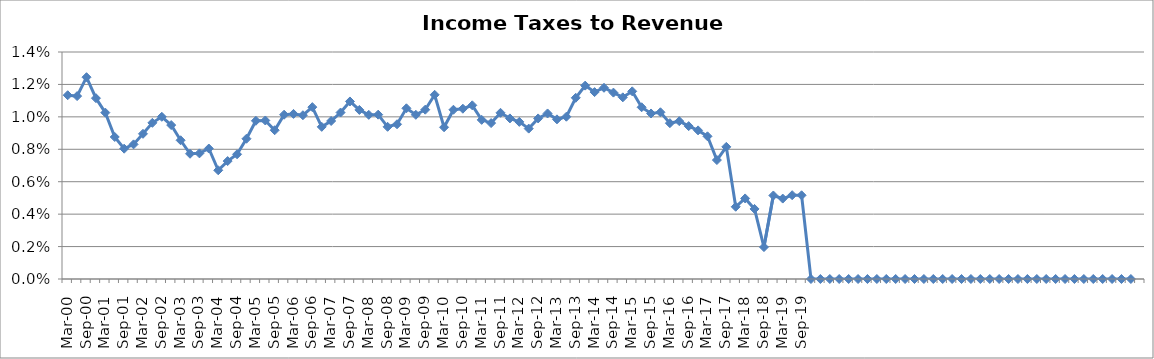
| Category | Income Taxes to Revenue (%) |
|---|---|
| Mar-00 | 0.011 |
| Jun-00 | 0.011 |
| Sep-00 | 0.012 |
| Dec-00 | 0.011 |
| Mar-01 | 0.01 |
| Jun-01 | 0.009 |
| Sep-01 | 0.008 |
| Dec-01 | 0.008 |
| Mar-02 | 0.009 |
| Jun-02 | 0.01 |
| Sep-02 | 0.01 |
| Dec-02 | 0.009 |
| Mar-03 | 0.009 |
| Jun-03 | 0.008 |
| Sep-03 | 0.008 |
| Dec-03 | 0.008 |
| Mar-04 | 0.007 |
| Jun-04 | 0.007 |
| Sep-04 | 0.008 |
| Dec-04 | 0.009 |
| Mar-05 | 0.01 |
| Jun-05 | 0.01 |
| Sep-05 | 0.009 |
| Dec-05 | 0.01 |
| Mar-06 | 0.01 |
| Jun-06 | 0.01 |
| Sep-06 | 0.011 |
| Dec-06 | 0.009 |
| Mar-07 | 0.01 |
| Jun-07 | 0.01 |
| Sep-07 | 0.011 |
| Dec-07 | 0.01 |
| Mar-08 | 0.01 |
| Jun-08 | 0.01 |
| Sep-08 | 0.009 |
| Dec-08 | 0.01 |
| Mar-09 | 0.011 |
| Jun-09 | 0.01 |
| Sep-09 | 0.01 |
| Dec-09 | 0.011 |
| Mar-10 | 0.009 |
| Jun-10 | 0.01 |
| Sep-10 | 0.011 |
| Dec-10 | 0.011 |
| Mar-11 | 0.01 |
| Jun-11 | 0.01 |
| Sep-11 | 0.01 |
| Dec-11 | 0.01 |
| Mar-12 | 0.01 |
| Jun-12 | 0.009 |
| Sep-12 | 0.01 |
| Dec-12 | 0.01 |
| Mar-13 | 0.01 |
| Jun-13 | 0.01 |
| Sep-13 | 0.011 |
| Dec-13 | 0.012 |
| Mar-14 | 0.012 |
| Jun-14 | 0.012 |
| Sep-14 | 0.011 |
| Dec-14 | 0.011 |
| Mar-15 | 0.012 |
| Jun-15 | 0.011 |
| Sep-15 | 0.01 |
| Dec-15 | 0.01 |
| Mar-16 | 0.01 |
| Jun-16 | 0.01 |
| Sep-16 | 0.009 |
| Dec-16 | 0.009 |
| Mar-17 | 0.009 |
| Jun-17 | 0.007 |
| Sep-17 | 0.008 |
| Dec-17 | 0.004 |
| Mar-18 | 0.005 |
| Jun-18 | 0.004 |
| Sep-18 | 0.002 |
| Dec-18 | 0.005 |
| Mar-19 | 0.005 |
| Jun-19 | 0.005 |
| Sep-19 | 0.005 |